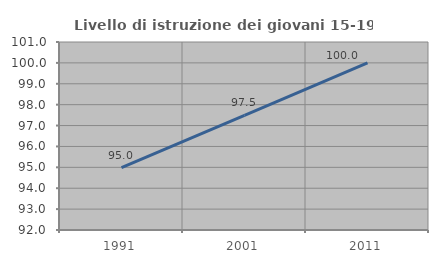
| Category | Livello di istruzione dei giovani 15-19 anni |
|---|---|
| 1991.0 | 94.982 |
| 2001.0 | 97.487 |
| 2011.0 | 100 |